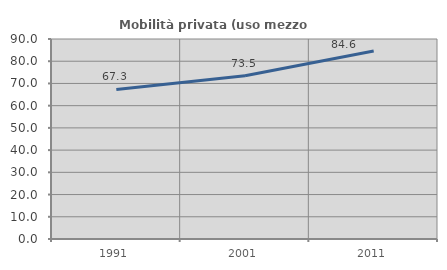
| Category | Mobilità privata (uso mezzo privato) |
|---|---|
| 1991.0 | 67.308 |
| 2001.0 | 73.506 |
| 2011.0 | 84.598 |